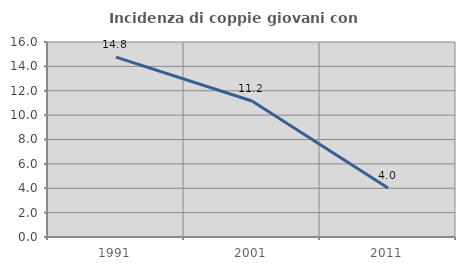
| Category | Incidenza di coppie giovani con figli |
|---|---|
| 1991.0 | 14.762 |
| 2001.0 | 11.161 |
| 2011.0 | 4.018 |